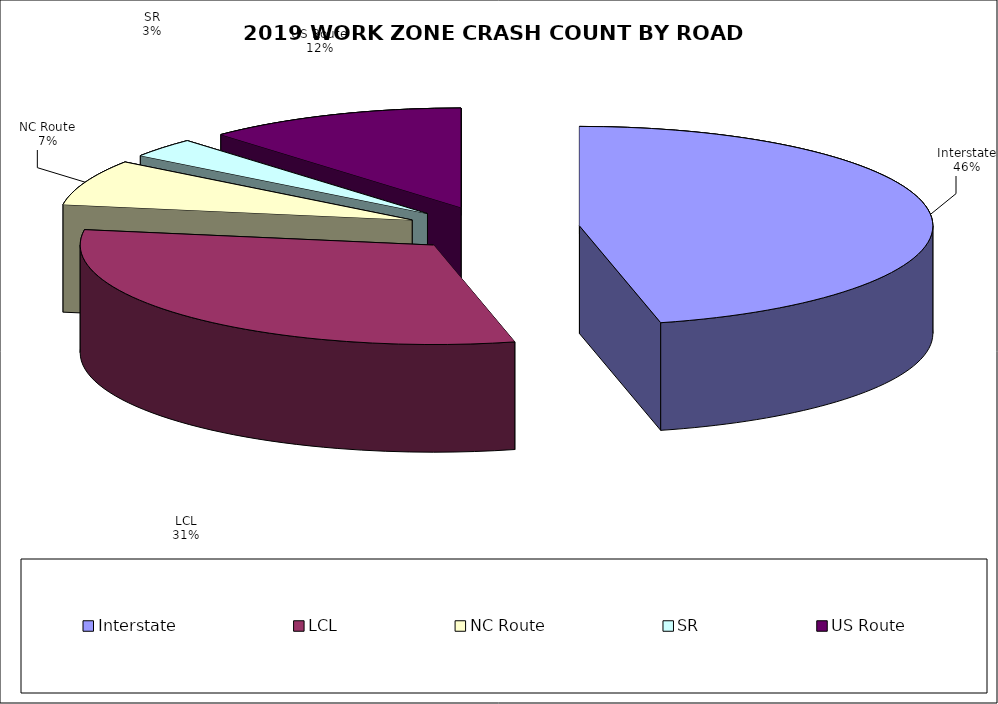
| Category | Series 0 | Series 1 |
|---|---|---|
| Interstate | 3255 | 0.463 |
| LCL | 2191 | 0.312 |
| NC Route | 522 | 0.074 |
| SR | 225 | 0.032 |
| US Route | 836 | 0.119 |